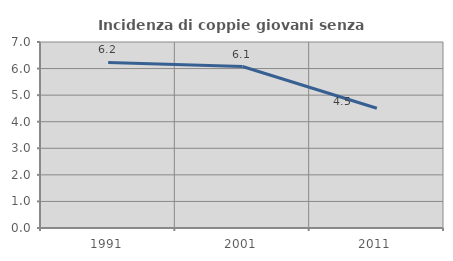
| Category | Incidenza di coppie giovani senza figli |
|---|---|
| 1991.0 | 6.23 |
| 2001.0 | 6.076 |
| 2011.0 | 4.508 |